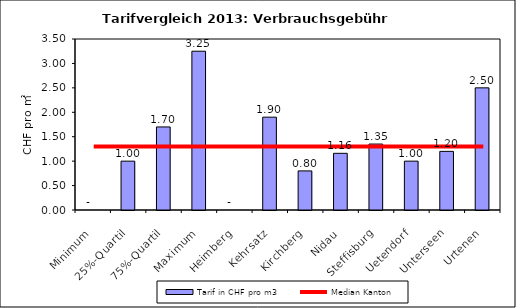
| Category | Tarif in CHF pro m3 |
|---|---|
| Minimum | 0 |
| 25%-Quartil | 1 |
| 75%-Quartil | 1.7 |
| Maximum | 3.25 |
| Heimberg | 0 |
| Kehrsatz | 1.9 |
| Kirchberg | 0.8 |
| Nidau | 1.16 |
| Steffisburg | 1.35 |
| Uetendorf | 1 |
| Unterseen | 1.2 |
| Urtenen | 2.5 |